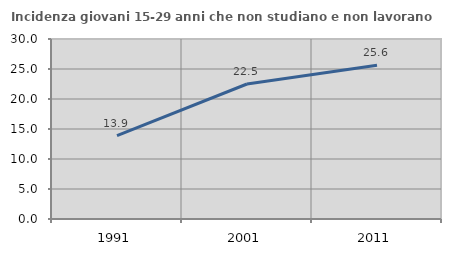
| Category | Incidenza giovani 15-29 anni che non studiano e non lavorano  |
|---|---|
| 1991.0 | 13.889 |
| 2001.0 | 22.5 |
| 2011.0 | 25.641 |